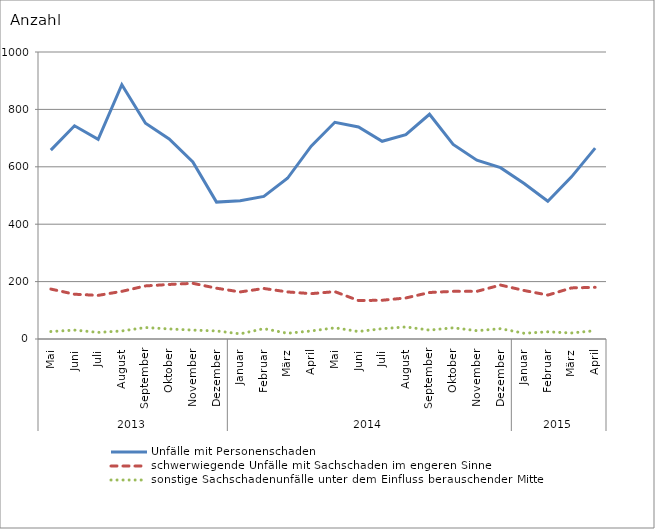
| Category | Unfälle mit Personenschaden | schwerwiegende Unfälle mit Sachschaden im engeren Sinne | sonstige Sachschadenunfälle unter dem Einfluss berauschender Mittel |
|---|---|---|---|
| 0 | 658 | 174 | 26 |
| 1 | 743 | 156 | 31 |
| 2 | 696 | 152 | 23 |
| 3 | 886 | 166 | 28 |
| 4 | 752 | 185 | 40 |
| 5 | 697 | 190 | 35 |
| 6 | 617 | 194 | 31 |
| 7 | 477 | 177 | 28 |
| 8 | 482 | 164 | 18 |
| 9 | 497 | 176 | 36 |
| 10 | 560 | 164 | 20 |
| 11 | 672 | 158 | 28 |
| 12 | 755 | 165 | 39 |
| 13 | 739 | 134 | 26 |
| 14 | 689 | 135 | 36 |
| 15 | 712 | 143 | 42 |
| 16 | 783 | 162 | 31 |
| 17 | 678 | 166 | 39 |
| 18 | 623 | 166 | 29 |
| 19 | 597 | 188 | 36 |
| 20 | 542 | 169 | 20 |
| 21 | 480 | 153 | 25 |
| 22 | 565 | 178 | 21 |
| 23 | 665 | 180 | 29 |